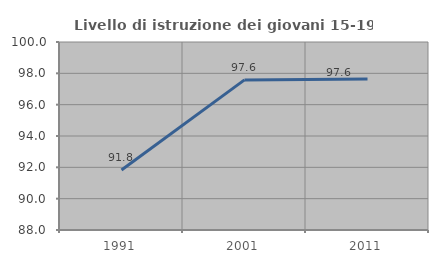
| Category | Livello di istruzione dei giovani 15-19 anni |
|---|---|
| 1991.0 | 91.83 |
| 2001.0 | 97.581 |
| 2011.0 | 97.638 |